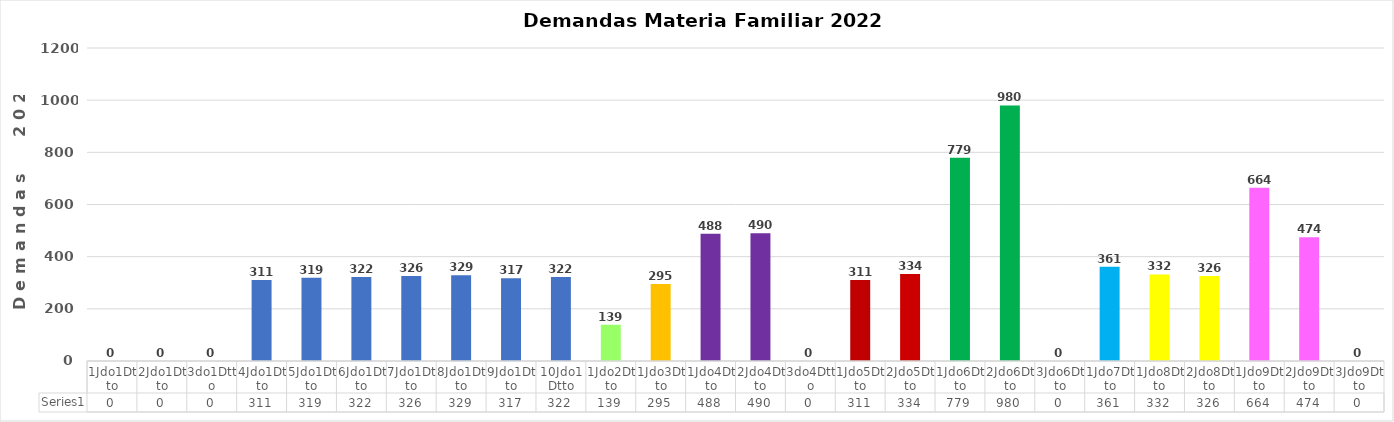
| Category | Series 0 |
|---|---|
| 1Jdo1Dtto | 0 |
| 2Jdo1Dtto | 0 |
| 3do1Dtto | 0 |
| 4Jdo1Dtto | 311 |
| 5Jdo1Dtto | 319 |
| 6Jdo1Dtto | 322 |
| 7Jdo1Dtto | 326 |
| 8Jdo1Dtto | 329 |
| 9Jdo1Dtto | 317 |
| 10Jdo1Dtto | 322 |
| 1Jdo2Dtto | 139 |
| 1Jdo3Dtto | 295 |
| 1Jdo4Dtto | 488 |
| 2Jdo4Dtto | 490 |
| 3do4Dtto | 0 |
| 1Jdo5Dtto | 311 |
| 2Jdo5Dtto | 334 |
| 1Jdo6Dtto | 779 |
| 2Jdo6Dtto | 980 |
| 3Jdo6Dtto | 0 |
| 1Jdo7Dtto | 361 |
| 1Jdo8Dtto | 332 |
| 2Jdo8Dtto | 326 |
| 1Jdo9Dtto | 664 |
| 2Jdo9Dtto | 474 |
| 3Jdo9Dtto | 0 |